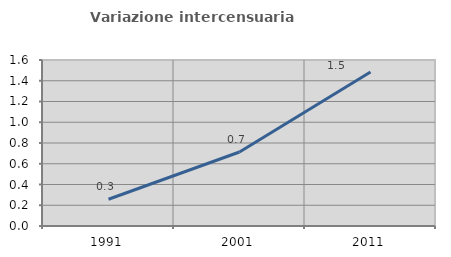
| Category | Variazione intercensuaria annua |
|---|---|
| 1991.0 | 0.258 |
| 2001.0 | 0.713 |
| 2011.0 | 1.484 |